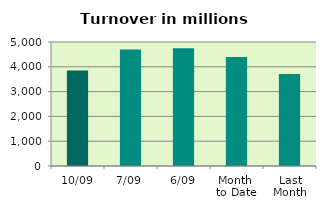
| Category | Series 0 |
|---|---|
| 10/09 | 3851.306 |
| 7/09 | 4698.388 |
| 6/09 | 4749.156 |
| Month 
to Date | 4390.197 |
| Last
Month | 3714.081 |